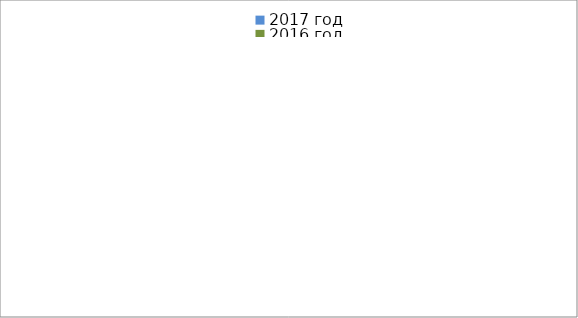
| Category | 2017 год | 2016 год |
|---|---|---|
|  - поджог | 2 | 4 |
|  - неосторожное обращение с огнём | 2 | 0 |
|  - НПТЭ электрооборудования | 4 | 1 |
|  - НПУ и Э печей | 16 | 11 |
|  - НПУ и Э транспортных средств | 12 | 14 |
|   -Шалость с огнем детей | 0 | 0 |
|  -НППБ при эксплуатации эл.приборов | 11 | 10 |
|  - курение | 8 | 1 |
| - прочие | 8 | 18 |
| - не установленные причины | 0 | 0 |